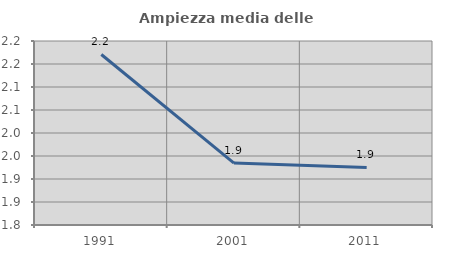
| Category | Ampiezza media delle famiglie |
|---|---|
| 1991.0 | 2.171 |
| 2001.0 | 1.935 |
| 2011.0 | 1.925 |